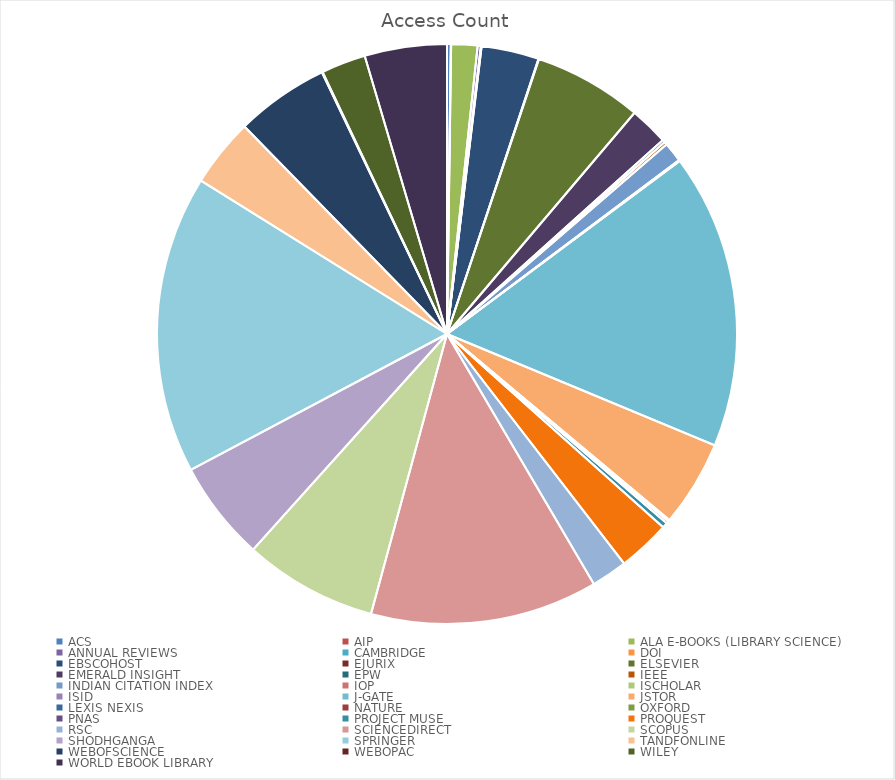
| Category | Access Count |
|---|---|
| ACS | 70 |
| AIP | 6 |
| ALA E-BOOKS (LIBRARY SCIENCE) | 489 |
| ANNUAL REVIEWS | 59 |
| CAMBRIDGE | 6 |
| DOI | 8 |
| EBSCOHOST | 1072 |
| EJURIX | 9 |
| ELSEVIER | 2026 |
| EMERALD INSIGHT | 723 |
| EPW | 50 |
| IEEE | 54 |
| INDIAN CITATION INDEX | 368 |
| IOP | 6 |
| ISCHOLAR | 8 |
| ISID | 8 |
| J-GATE | 5503 |
| JSTOR | 1613 |
| LEXIS NEXIS | 10 |
| NATURE | 7 |
| OXFORD | 14 |
| PNAS | 44 |
| PROJECT MUSE | 99 |
| PROQUEST | 980 |
| RSC | 672 |
| SCIENCEDIRECT | 4241 |
| SCOPUS | 2488 |
| SHODHGANGA | 1870 |
| SPRINGER | 5566 |
| TANDFONLINE | 1277 |
| WEBOFSCIENCE | 1745 |
| WEBOPAC | 13 |
| WILEY | 830 |
| WORLD EBOOK LIBRARY | 1532 |